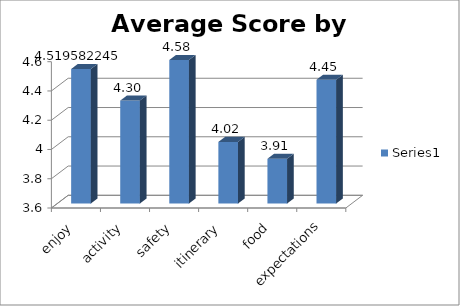
| Category | Series 0 |
|---|---|
| enjoy | 4.52 |
| activity | 4.304 |
| safety | 4.581 |
| itinerary | 4.021 |
| food | 3.906 |
| expectations | 4.446 |